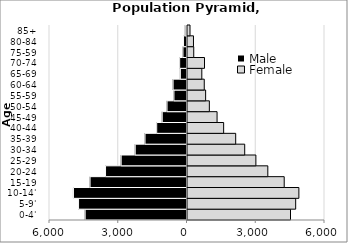
| Category | Male | Female |
|---|---|---|
| 0-4' | -4444.25 | 4494.83 |
| 5-9' | -4732.31 | 4720.88 |
| 10-14' | -4954.9 | 4860.08 |
| 15-19 | -4229.94 | 4220.21 |
| 20-24 | -3554.92 | 3505.18 |
| 25-29 | -2873.08 | 2984.25 |
| 30-34 | -2259.65 | 2496.26 |
| 35-39 | -1831.58 | 2102.93 |
| 40-44 | -1322.65 | 1577.06 |
| 45-49 | -1081.04 | 1290.28 |
| 50-54 | -871.1 | 953.28 |
| 55-59 | -569.69 | 791.51 |
| 60-64 | -606.65 | 731.13 |
| 65-69 | -289.56 | 625.03 |
| 70-74 | -320.4 | 742.07 |
| 75-59 | -176.46 | 272.24 |
| 80-84 | -151.01 | 260.56 |
| 85+ | -75.1 | 109.53 |